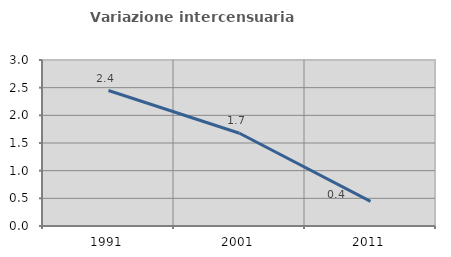
| Category | Variazione intercensuaria annua |
|---|---|
| 1991.0 | 2.448 |
| 2001.0 | 1.676 |
| 2011.0 | 0.444 |